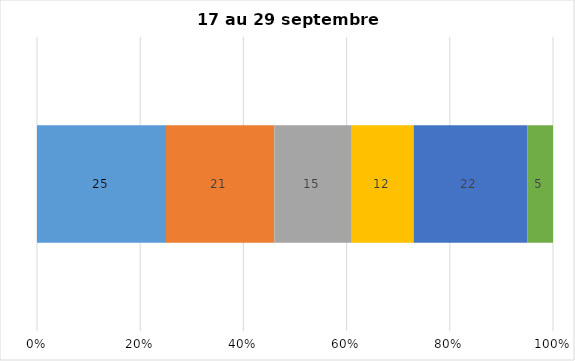
| Category | Plusieurs fois par jour | Une fois par jour | Quelques fois par semaine   | Une fois par semaine ou moins   |  Jamais   |  Je n’utilise pas les médias sociaux |
|---|---|---|---|---|---|---|
| 0 | 25 | 21 | 15 | 12 | 22 | 5 |